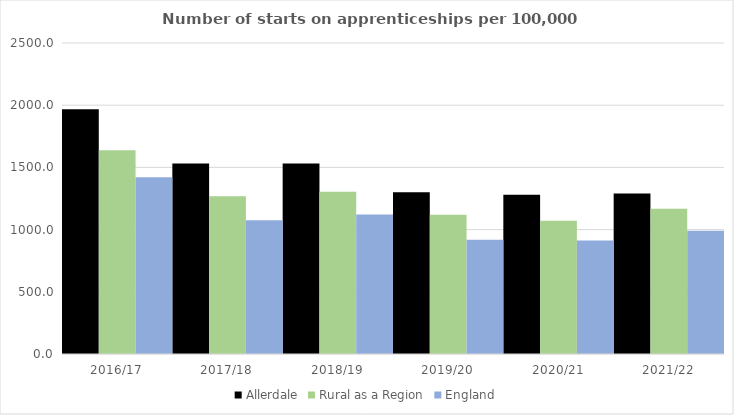
| Category | Allerdale | Rural as a Region | England |
|---|---|---|---|
| 2016/17 | 1967 | 1638.789 | 1420 |
| 2017/18 | 1531 | 1267.474 | 1075 |
| 2018/19 | 1531 | 1304.57 | 1122 |
| 2019/20 | 1301 | 1119.662 | 918 |
| 2020/21 | 1281 | 1070.748 | 912 |
| 2021/22 | 1291 | 1167.68 | 991 |